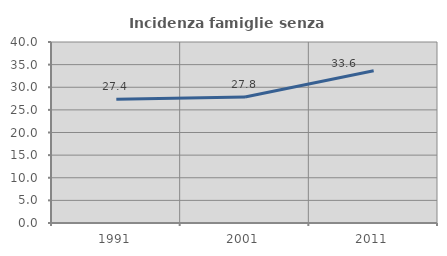
| Category | Incidenza famiglie senza nuclei |
|---|---|
| 1991.0 | 27.35 |
| 2001.0 | 27.843 |
| 2011.0 | 33.641 |